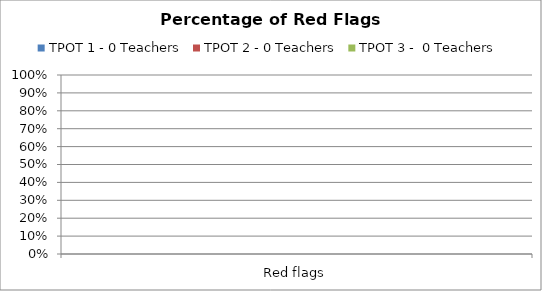
| Category | TPOT 1 - 0 Teachers | TPOT 2 - 0 Teachers | TPOT 3 -  0 Teachers |
|---|---|---|---|
| Red flags | 0 | 0 | 0 |